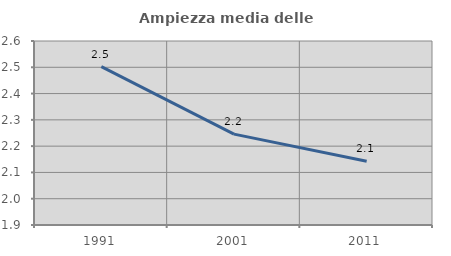
| Category | Ampiezza media delle famiglie |
|---|---|
| 1991.0 | 2.503 |
| 2001.0 | 2.246 |
| 2011.0 | 2.143 |